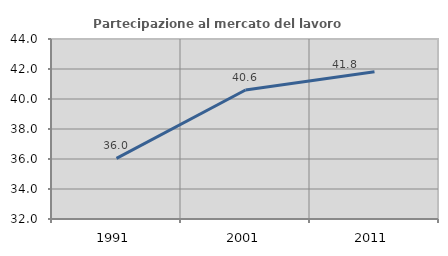
| Category | Partecipazione al mercato del lavoro  femminile |
|---|---|
| 1991.0 | 36.038 |
| 2001.0 | 40.602 |
| 2011.0 | 41.815 |